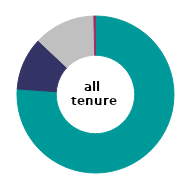
| Category | all 
tenures |
|---|---|
| direct debit | 76.123 |
| standing order | 10.902 |
| pre-paid meter | 12.64 |
| other | 0.335 |